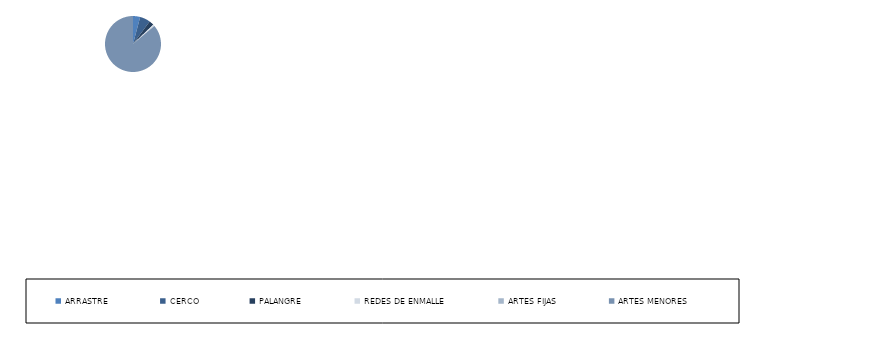
| Category | Series 0 |
|---|---|
| ARRASTRE | 9 |
| CERCO | 13 |
| PALANGRE | 6 |
| REDES DE ENMALLE | 2 |
| ARTES FIJAS | 0 |
| ARTES MENORES | 187 |